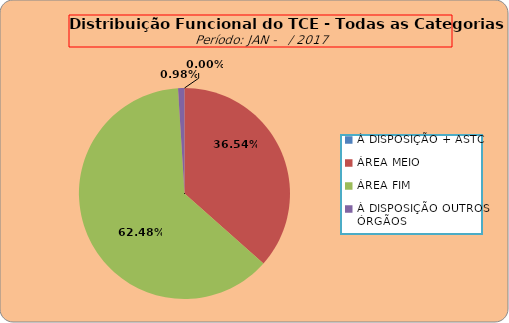
| Category | Series 0 |
|---|---|
| À DISPOSIÇÃO + ASTC | 0 |
| ÁREA MEIO | 186 |
| ÁREA FIM | 318 |
| À DISPOSIÇÃO OUTROS ÓRGÃOS | 5 |